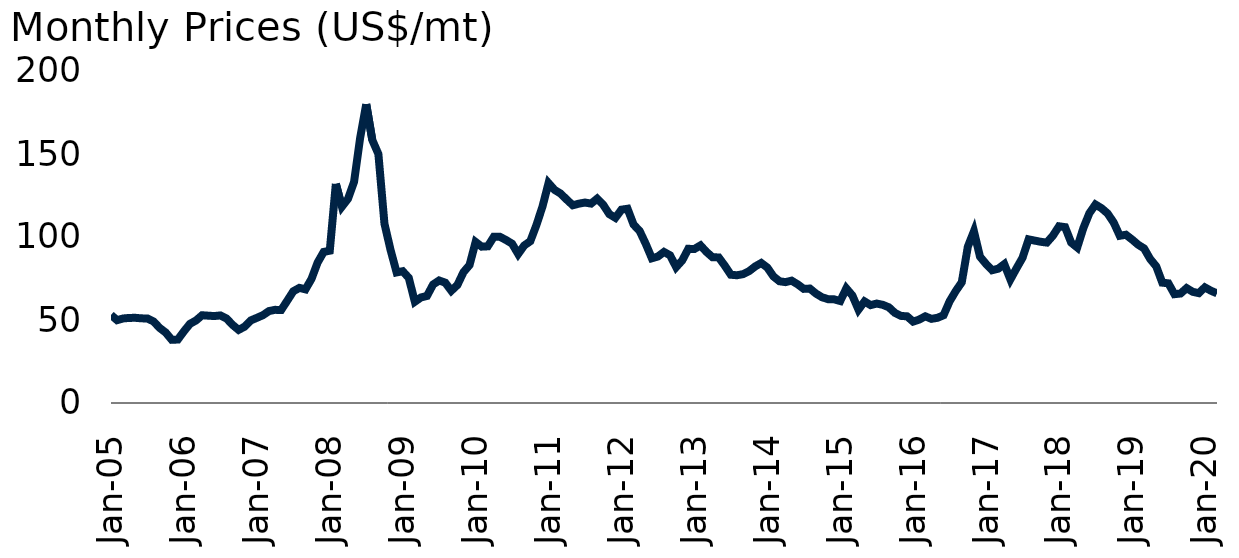
| Category | Coal |
|---|---|
| 2005-01-01 | 53.045 |
| 2005-02-01 | 49.898 |
| 2005-03-01 | 50.925 |
| 2005-04-01 | 51.25 |
| 2005-05-01 | 51.312 |
| 2005-06-01 | 51 |
| 2005-07-01 | 50.9 |
| 2005-08-01 | 49.125 |
| 2005-09-01 | 45.25 |
| 2005-10-01 | 42.458 |
| 2005-11-01 | 38.062 |
| 2005-12-01 | 38.225 |
| 2006-01-01 | 43.188 |
| 2006-02-01 | 47.7 |
| 2006-03-01 | 49.75 |
| 2006-04-01 | 52.875 |
| 2006-05-01 | 52.6 |
| 2006-06-01 | 52.375 |
| 2006-07-01 | 52.75 |
| 2006-08-01 | 50.938 |
| 2006-09-01 | 47.1 |
| 2006-10-01 | 44.05 |
| 2006-11-01 | 46 |
| 2006-12-01 | 49.75 |
| 2007-01-01 | 51.288 |
| 2007-02-01 | 52.9 |
| 2007-03-01 | 55.38 |
| 2007-04-01 | 56.12 |
| 2007-05-01 | 56 |
| 2007-06-01 | 61.6 |
| 2007-07-01 | 67.31 |
| 2007-08-01 | 69.35 |
| 2007-09-01 | 68.44 |
| 2007-10-01 | 74.81 |
| 2007-11-01 | 84.6 |
| 2007-12-01 | 91 |
| 2008-01-01 | 91.75 |
| 2008-02-01 | 132 |
| 2008-03-01 | 118.25 |
| 2008-04-01 | 123 |
| 2008-05-01 | 133.2 |
| 2008-06-01 | 159.75 |
| 2008-07-01 | 180 |
| 2008-08-01 | 158.4 |
| 2008-09-01 | 150 |
| 2008-10-01 | 108 |
| 2008-11-01 | 92.25 |
| 2008-12-01 | 78.65 |
| 2009-01-01 | 79.4 |
| 2009-02-01 | 75.38 |
| 2009-03-01 | 61 |
| 2009-04-01 | 63.56 |
| 2009-05-01 | 64.5 |
| 2009-06-01 | 71.38 |
| 2009-07-01 | 73.8 |
| 2009-08-01 | 72.5 |
| 2009-09-01 | 67.64 |
| 2009-10-01 | 71.07 |
| 2009-11-01 | 78.8 |
| 2009-12-01 | 83.1 |
| 2010-01-01 | 97 |
| 2010-02-01 | 94.19 |
| 2010-03-01 | 94.375 |
| 2010-04-01 | 100.15 |
| 2010-05-01 | 100.13 |
| 2010-06-01 | 98.188 |
| 2010-07-01 | 95.98 |
| 2010-08-01 | 89.78 |
| 2010-09-01 | 94.9 |
| 2010-10-01 | 97.45 |
| 2010-11-01 | 107.16 |
| 2010-12-01 | 118.29 |
| 2011-01-01 | 132.48 |
| 2011-02-01 | 128.36 |
| 2011-03-01 | 126.13 |
| 2011-04-01 | 122.5 |
| 2011-05-01 | 119.12 |
| 2011-06-01 | 120.09 |
| 2011-07-01 | 120.75 |
| 2011-08-01 | 120.13 |
| 2011-09-01 | 123.09 |
| 2011-10-01 | 119.39 |
| 2011-11-01 | 113.78 |
| 2011-12-01 | 111.56 |
| 2012-01-01 | 116.46 |
| 2012-02-01 | 117.02 |
| 2012-03-01 | 107.46 |
| 2012-04-01 | 103.59 |
| 2012-05-01 | 95.83 |
| 2012-06-01 | 87.19 |
| 2012-07-01 | 88.24 |
| 2012-08-01 | 91 |
| 2012-09-01 | 88.96 |
| 2012-10-01 | 81.85 |
| 2012-11-01 | 85.89 |
| 2012-12-01 | 92.88 |
| 2013-01-01 | 92.77 |
| 2013-02-01 | 94.94 |
| 2013-03-01 | 90.98 |
| 2013-04-01 | 87.76 |
| 2013-05-01 | 87.71 |
| 2013-06-01 | 82.754 |
| 2013-07-01 | 77.259 |
| 2013-08-01 | 76.96 |
| 2013-09-01 | 77.612 |
| 2013-10-01 | 79.412 |
| 2013-11-01 | 82.25 |
| 2013-12-01 | 84.338 |
| 2014-01-01 | 81.61 |
| 2014-02-01 | 76.29 |
| 2014-03-01 | 73.34 |
| 2014-04-01 | 72.82 |
| 2014-05-01 | 73.69 |
| 2014-06-01 | 71.48 |
| 2014-07-01 | 68.75 |
| 2014-08-01 | 68.94 |
| 2014-09-01 | 65.94 |
| 2014-10-01 | 63.71 |
| 2014-11-01 | 62.55 |
| 2014-12-01 | 62.44 |
| 2015-01-01 | 61.44 |
| 2015-02-01 | 69.05 |
| 2015-03-01 | 64.76 |
| 2015-04-01 | 56.24 |
| 2015-05-01 | 61.19 |
| 2015-06-01 | 58.96 |
| 2015-07-01 | 59.9 |
| 2015-08-01 | 59.14 |
| 2015-09-01 | 57.65 |
| 2015-10-01 | 54.26 |
| 2015-11-01 | 52.47 |
| 2015-12-01 | 52.21 |
| 2016-01-01 | 49.02 |
| 2016-02-01 | 50.27 |
| 2016-03-01 | 52.21 |
| 2016-04-01 | 50.69 |
| 2016-05-01 | 51.31 |
| 2016-06-01 | 52.85 |
| 2016-07-01 | 61.24 |
| 2016-08-01 | 67.39 |
| 2016-09-01 | 72.72 |
| 2016-10-01 | 94.2 |
| 2016-11-01 | 103.43 |
| 2016-12-01 | 88.15 |
| 2017-01-01 | 83.73 |
| 2017-02-01 | 79.98 |
| 2017-03-01 | 80.9 |
| 2017-04-01 | 83.65 |
| 2017-05-01 | 74.42 |
| 2017-06-01 | 81.09 |
| 2017-07-01 | 87.49 |
| 2017-08-01 | 98.58 |
| 2017-09-01 | 97.82 |
| 2017-10-01 | 97.11 |
| 2017-11-01 | 96.64 |
| 2017-12-01 | 100.81 |
| 2018-01-01 | 106.45 |
| 2018-02-01 | 105.95 |
| 2018-03-01 | 96.66 |
| 2018-04-01 | 93.69 |
| 2018-05-01 | 105.29 |
| 2018-06-01 | 114.33 |
| 2018-07-01 | 119.57 |
| 2018-08-01 | 117.34 |
| 2018-09-01 | 114.16 |
| 2018-10-01 | 108.73 |
| 2018-11-01 | 100.73 |
| 2018-12-01 | 101.37 |
| 2019-01-01 | 98.56 |
| 2019-02-01 | 95.42 |
| 2019-03-01 | 93.12 |
| 2019-04-01 | 86.77 |
| 2019-05-01 | 82.32 |
| 2019-06-01 | 72.49 |
| 2019-07-01 | 72.08 |
| 2019-08-01 | 65.55 |
| 2019-09-01 | 65.95 |
| 2019-10-01 | 69.2 |
| 2019-11-01 | 66.99 |
| 2019-12-01 | 66.18 |
| 2020-01-01 | 69.66 |
| 2020-02-01 | 67.64 |
| 2020-03-01 | 66.06 |